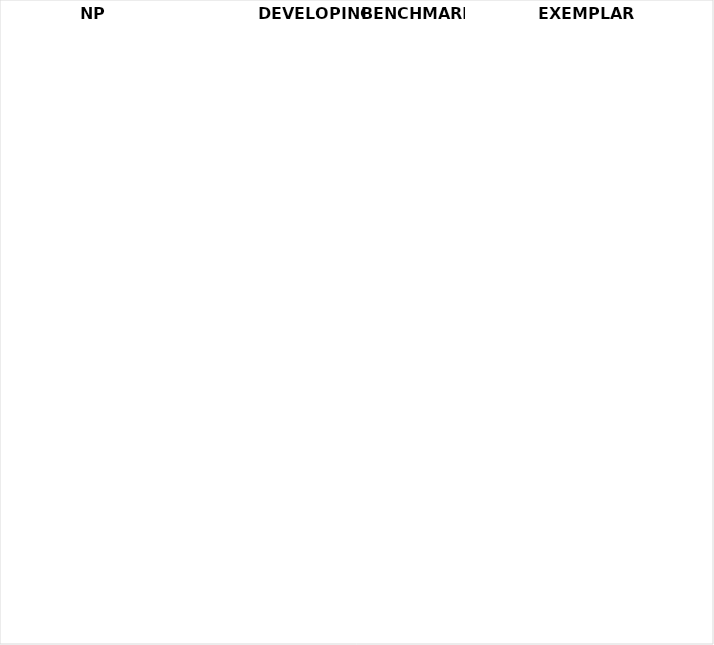
| Category | Series 1 | NP | Developing | Benchmark | Exemplary | Series 5 |
|---|---|---|---|---|---|---|
| ALL PTEPA STANDARDS | 1 |  |  |  |  | 1 |
| STANDARD 1: INSTITUTIONAL COMMITMENT | 1 |  |  |  |  | 1 |
| Component 1A: Institutional Climate and Support | 1 |  |  |  |  | 1 |
| Component 1B: Reward Structure | 1 |  |  |  |  | 1 |
| Component 1C: Resources  | 1 |  |  |  |  | 1 |
| STANDARD 2: LEADERSHIP AND COLLABORATION | 1 |  |  |  |  | 1 |
| Component 2A: Program Team Members | 1 |  |  |  |  | 1 |
| Component 2B: Program Team Attributes | 1 |  |  |  |  | 1 |
| Component 2C: Program Collaboration | 1 |  |  |  |  | 1 |
| STANDARD 3: RECRUITMENT | 1 |  |  |  |  | 1 |
| Component 3A: Recruitment Opportunities | 1 |  |  |  |  | 1 |
| Component 3B: Recruitment Activities  | 1 |  |  |  |  | 1 |
| Component 3C: Early Teaching Experiences for Recruiting Teacher Candidates | 1 |  |  |  |  | 1 |
| Component 3D: Streamlined and Accessible Program Options | 1 |  |  |  |  | 1 |
| STANDARD 4: KNOWLEDGE AND SKILLS FOR TEACHING PHYSICS | 1 |  |  |  |  | 1 |
| Component 4A: Physics Content Knowledge | 1 |  |  |  |  | 1 |
| Component 4B: Pedagogy Courses and Curriculum | 1 |  |  |  |  | 1 |
| Component 4C: Practical K–12 School Experiences  | 1 |  |  |  |  | 1 |
| STANDARD 5: MENTORING, COMMUNITY, AND PROFESSIONAL SUPPORT | 1 |  |  |  |  | 1 |
| Component 5A: Mentoring and Community Support Toward a Physics Degree | 1 |  |  |  |  | 1 |
| Component 5B: Mentoring and Community Support Toward Becoming a Physics Teacher | 1 |  |  |  |  | 1 |
| Component 5C: In-service Mentoring and Professional Community | 1 |  |  |  |  | 1 |
| STANDARD 6: PROGRAM ASSESSMENT | 1 |  |  |  |  | 1 |
| Component 6A: Program Outcomes | 1 |  |  |  |  | 1 |
| Component 6B: Program Evaluation and Improvement | 1 |  |  |  |  | 1 |
| Component 6C: Communication to Stakeholders | 1 |  |  |  |  | 1 |